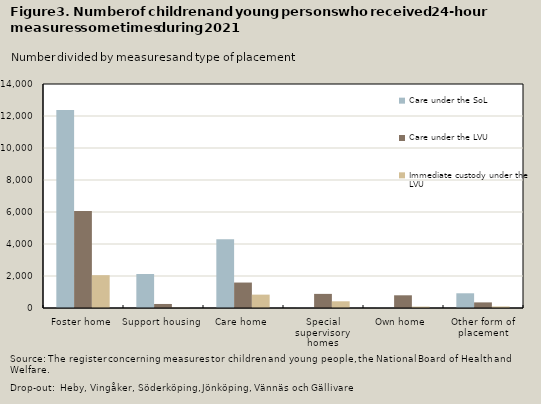
| Category | Care under the SoL | Care under the LVU | Immediate custody under the LVU |
|---|---|---|---|
| Foster home | 12376 | 6065 | 2052 |
| Support housing | 2125 | 252 | 18 |
| Care home | 4294 | 1591 | 836 |
| Special supervisory homes | 8 | 882 | 419 |
| Own home | 7 | 794 | 86 |
| Other form of placement | 920 | 351 | 96 |